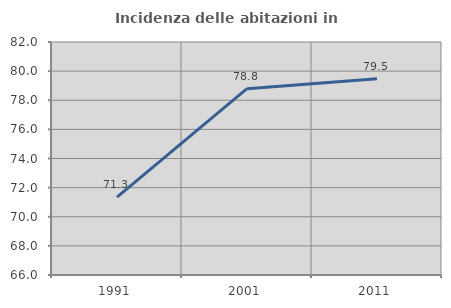
| Category | Incidenza delle abitazioni in proprietà  |
|---|---|
| 1991.0 | 71.347 |
| 2001.0 | 78.797 |
| 2011.0 | 79.481 |